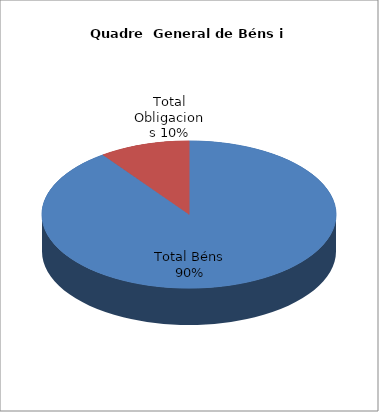
| Category | Series 0 |
|---|---|
| Total Béns | 172500191.27 |
| Total Obligacions | 19085851.2 |